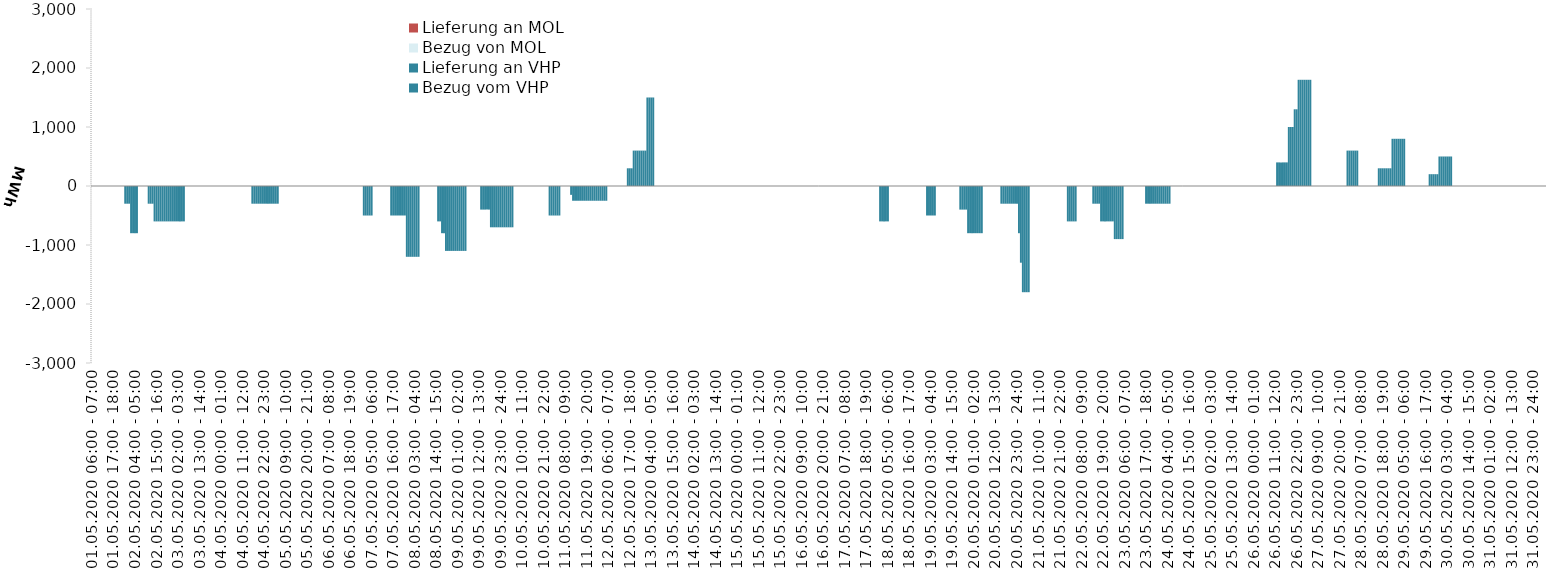
| Category | Bezug vom VHP | Lieferung an VHP | Bezug von MOL | Lieferung an MOL |
|---|---|---|---|---|
| 01.05.2020 06:00 - 07:00 | 0 | 0 | 0 | 0 |
| 01.05.2020 07:00 - 08:00 | 0 | 0 | 0 | 0 |
| 01.05.2020 08:00 - 09:00 | 0 | 0 | 0 | 0 |
| 01.05.2020 09:00 - 10:00 | 0 | 0 | 0 | 0 |
| 01.05.2020 10:00 - 11:00 | 0 | 0 | 0 | 0 |
| 01.05.2020 11:00 - 12:00 | 0 | 0 | 0 | 0 |
| 01.05.2020 12:00 - 13:00 | 0 | 0 | 0 | 0 |
| 01.05.2020 13:00 - 14:00 | 0 | 0 | 0 | 0 |
| 01.05.2020 14:00 - 15:00 | 0 | 0 | 0 | 0 |
| 01.05.2020 15:00 - 16:00 | 0 | 0 | 0 | 0 |
| 01.05.2020 16:00 - 17:00 | 0 | 0 | 0 | 0 |
| 01.05.2020 17:00 - 18:00 | 0 | 0 | 0 | 0 |
| 01.05.2020 18:00 - 19:00 | 0 | 0 | 0 | 0 |
| 01.05.2020 19:00 - 20:00 | 0 | 0 | 0 | 0 |
| 01.05.2020 20:00 - 21:00 | 0 | 0 | 0 | 0 |
| 01.05.2020 21:00 - 22:00 | 0 | 0 | 0 | 0 |
| 01.05.2020 22:00 - 23:00 | 0 | 0 | 0 | 0 |
| 01.05.2020 23:00 - 24:00 | 0 | -300 | 0 | 0 |
| 02.05.2020 00:00 - 01:00 | 0 | -300 | 0 | 0 |
| 02.05.2020 01:00 - 02:00 | 0 | -300 | 0 | 0 |
| 02.05.2020 02:00 - 03:00 | 0 | -800 | 0 | 0 |
| 02.05.2020 03:00 - 04:00 | 0 | -800 | 0 | 0 |
| 02.05.2020 04:00 - 05:00 | 0 | -800 | 0 | 0 |
| 02.05.2020 05:00 - 06:00 | 0 | -800 | 0 | 0 |
| 02.05.2020 06:00 - 07:00 | 0 | 0 | 0 | 0 |
| 02.05.2020 07:00 - 08:00 | 0 | 0 | 0 | 0 |
| 02.05.2020 08:00 - 09:00 | 0 | 0 | 0 | 0 |
| 02.05.2020 09:00 - 10:00 | 0 | 0 | 0 | 0 |
| 02.05.2020 10:00 - 11:00 | 0 | 0 | 0 | 0 |
| 02.05.2020 11:00 - 12:00 | 0 | -300 | 0 | 0 |
| 02.05.2020 12:00 - 13:00 | 0 | -300 | 0 | 0 |
| 02.05.2020 13:00 - 14:00 | 0 | -300 | 0 | 0 |
| 02.05.2020 14:00 - 15:00 | 0 | -600 | 0 | 0 |
| 02.05.2020 15:00 - 16:00 | 0 | -600 | 0 | 0 |
| 02.05.2020 16:00 - 17:00 | 0 | -600 | 0 | 0 |
| 02.05.2020 17:00 - 18:00 | 0 | -600 | 0 | 0 |
| 02.05.2020 18:00 - 19:00 | 0 | -600 | 0 | 0 |
| 02.05.2020 19:00 - 20:00 | 0 | -600 | 0 | 0 |
| 02.05.2020 20:00 - 21:00 | 0 | -600 | 0 | 0 |
| 02.05.2020 21:00 - 22:00 | 0 | -600 | 0 | 0 |
| 02.05.2020 22:00 - 23:00 | 0 | -600 | 0 | 0 |
| 02.05.2020 23:00 - 24:00 | 0 | -600 | 0 | 0 |
| 03.05.2020 00:00 - 01:00 | 0 | -600 | 0 | 0 |
| 03.05.2020 01:00 - 02:00 | 0 | -600 | 0 | 0 |
| 03.05.2020 02:00 - 03:00 | 0 | -600 | 0 | 0 |
| 03.05.2020 03:00 - 04:00 | 0 | -600 | 0 | 0 |
| 03.05.2020 04:00 - 05:00 | 0 | -600 | 0 | 0 |
| 03.05.2020 05:00 - 06:00 | 0 | -600 | 0 | 0 |
| 03.05.2020 06:00 - 07:00 | 0 | 0 | 0 | 0 |
| 03.05.2020 07:00 - 08:00 | 0 | 0 | 0 | 0 |
| 03.05.2020 08:00 - 09:00 | 0 | 0 | 0 | 0 |
| 03.05.2020 09:00 - 10:00 | 0 | 0 | 0 | 0 |
| 03.05.2020 10:00 - 11:00 | 0 | 0 | 0 | 0 |
| 03.05.2020 11:00 - 12:00 | 0 | 0 | 0 | 0 |
| 03.05.2020 12:00 - 13:00 | 0 | 0 | 0 | 0 |
| 03.05.2020 13:00 - 14:00 | 0 | 0 | 0 | 0 |
| 03.05.2020 14:00 - 15:00 | 0 | 0 | 0 | 0 |
| 03.05.2020 15:00 - 16:00 | 0 | 0 | 0 | 0 |
| 03.05.2020 16:00 - 17:00 | 0 | 0 | 0 | 0 |
| 03.05.2020 17:00 - 18:00 | 0 | 0 | 0 | 0 |
| 03.05.2020 18:00 - 19:00 | 0 | 0 | 0 | 0 |
| 03.05.2020 19:00 - 20:00 | 0 | 0 | 0 | 0 |
| 03.05.2020 20:00 - 21:00 | 0 | 0 | 0 | 0 |
| 03.05.2020 21:00 - 22:00 | 0 | 0 | 0 | 0 |
| 03.05.2020 22:00 - 23:00 | 0 | 0 | 0 | 0 |
| 03.05.2020 23:00 - 24:00 | 0 | 0 | 0 | 0 |
| 04.05.2020 00:00 - 01:00 | 0 | 0 | 0 | 0 |
| 04.05.2020 01:00 - 02:00 | 0 | 0 | 0 | 0 |
| 04.05.2020 02:00 - 03:00 | 0 | 0 | 0 | 0 |
| 04.05.2020 03:00 - 04:00 | 0 | 0 | 0 | 0 |
| 04.05.2020 04:00 - 05:00 | 0 | 0 | 0 | 0 |
| 04.05.2020 05:00 - 06:00 | 0 | 0 | 0 | 0 |
| 04.05.2020 06:00 - 07:00 | 0 | 0 | 0 | 0 |
| 04.05.2020 07:00 - 08:00 | 0 | 0 | 0 | 0 |
| 04.05.2020 08:00 - 09:00 | 0 | 0 | 0 | 0 |
| 04.05.2020 09:00 - 10:00 | 0 | 0 | 0 | 0 |
| 04.05.2020 10:00 - 11:00 | 0 | 0 | 0 | 0 |
| 04.05.2020 11:00 - 12:00 | 0 | 0 | 0 | 0 |
| 04.05.2020 12:00 - 13:00 | 0 | 0 | 0 | 0 |
| 04.05.2020 13:00 - 14:00 | 0 | 0 | 0 | 0 |
| 04.05.2020 14:00 - 15:00 | 0 | 0 | 0 | 0 |
| 04.05.2020 15:00 - 16:00 | 0 | 0 | 0 | 0 |
| 04.05.2020 16:00 - 17:00 | 0 | -300 | 0 | 0 |
| 04.05.2020 17:00 - 18:00 | 0 | -300 | 0 | 0 |
| 04.05.2020 18:00 - 19:00 | 0 | -300 | 0 | 0 |
| 04.05.2020 19:00 - 20:00 | 0 | -300 | 0 | 0 |
| 04.05.2020 20:00 - 21:00 | 0 | -300 | 0 | 0 |
| 04.05.2020 21:00 - 22:00 | 0 | -300 | 0 | 0 |
| 04.05.2020 22:00 - 23:00 | 0 | -300 | 0 | 0 |
| 04.05.2020 23:00 - 24:00 | 0 | -300 | 0 | 0 |
| 05.05.2020 00:00 - 01:00 | 0 | -300 | 0 | 0 |
| 05.05.2020 01:00 - 02:00 | 0 | -300 | 0 | 0 |
| 05.05.2020 02:00 - 03:00 | 0 | -300 | 0 | 0 |
| 05.05.2020 03:00 - 04:00 | 0 | -300 | 0 | 0 |
| 05.05.2020 04:00 - 05:00 | 0 | -300 | 0 | 0 |
| 05.05.2020 05:00 - 06:00 | 0 | -300 | 0 | 0 |
| 05.05.2020 06:00 - 07:00 | 0 | 0 | 0 | 0 |
| 05.05.2020 07:00 - 08:00 | 0 | 0 | 0 | 0 |
| 05.05.2020 08:00 - 09:00 | 0 | 0 | 0 | 0 |
| 05.05.2020 09:00 - 10:00 | 0 | 0 | 0 | 0 |
| 05.05.2020 10:00 - 11:00 | 0 | 0 | 0 | 0 |
| 05.05.2020 11:00 - 12:00 | 0 | 0 | 0 | 0 |
| 05.05.2020 12:00 - 13:00 | 0 | 0 | 0 | 0 |
| 05.05.2020 13:00 - 14:00 | 0 | 0 | 0 | 0 |
| 05.05.2020 14:00 - 15:00 | 0 | 0 | 0 | 0 |
| 05.05.2020 15:00 - 16:00 | 0 | 0 | 0 | 0 |
| 05.05.2020 16:00 - 17:00 | 0 | 0 | 0 | 0 |
| 05.05.2020 17:00 - 18:00 | 0 | 0 | 0 | 0 |
| 05.05.2020 18:00 - 19:00 | 0 | 0 | 0 | 0 |
| 05.05.2020 19:00 - 20:00 | 0 | 0 | 0 | 0 |
| 05.05.2020 20:00 - 21:00 | 0 | 0 | 0 | 0 |
| 05.05.2020 21:00 - 22:00 | 0 | 0 | 0 | 0 |
| 05.05.2020 22:00 - 23:00 | 0 | 0 | 0 | 0 |
| 05.05.2020 23:00 - 24:00 | 0 | 0 | 0 | 0 |
| 06.05.2020 00:00 - 01:00 | 0 | 0 | 0 | 0 |
| 06.05.2020 01:00 - 02:00 | 0 | 0 | 0 | 0 |
| 06.05.2020 02:00 - 03:00 | 0 | 0 | 0 | 0 |
| 06.05.2020 03:00 - 04:00 | 0 | 0 | 0 | 0 |
| 06.05.2020 04:00 - 05:00 | 0 | 0 | 0 | 0 |
| 06.05.2020 05:00 - 06:00 | 0 | 0 | 0 | 0 |
| 06.05.2020 06:00 - 07:00 | 0 | 0 | 0 | 0 |
| 06.05.2020 07:00 - 08:00 | 0 | 0 | 0 | 0 |
| 06.05.2020 08:00 - 09:00 | 0 | 0 | 0 | 0 |
| 06.05.2020 09:00 - 10:00 | 0 | 0 | 0 | 0 |
| 06.05.2020 10:00 - 11:00 | 0 | 0 | 0 | 0 |
| 06.05.2020 11:00 - 12:00 | 0 | 0 | 0 | 0 |
| 06.05.2020 12:00 - 13:00 | 0 | 0 | 0 | 0 |
| 06.05.2020 13:00 - 14:00 | 0 | 0 | 0 | 0 |
| 06.05.2020 14:00 - 15:00 | 0 | 0 | 0 | 0 |
| 06.05.2020 15:00 - 16:00 | 0 | 0 | 0 | 0 |
| 06.05.2020 16:00 - 17:00 | 0 | 0 | 0 | 0 |
| 06.05.2020 17:00 - 18:00 | 0 | 0 | 0 | 0 |
| 06.05.2020 18:00 - 19:00 | 0 | 0 | 0 | 0 |
| 06.05.2020 19:00 - 20:00 | 0 | 0 | 0 | 0 |
| 06.05.2020 20:00 - 21:00 | 0 | 0 | 0 | 0 |
| 06.05.2020 21:00 - 22:00 | 0 | 0 | 0 | 0 |
| 06.05.2020 22:00 - 23:00 | 0 | 0 | 0 | 0 |
| 06.05.2020 23:00 - 24:00 | 0 | 0 | 0 | 0 |
| 07.05.2020 00:00 - 01:00 | 0 | 0 | 0 | 0 |
| 07.05.2020 01:00 - 02:00 | 0 | -500 | 0 | 0 |
| 07.05.2020 02:00 - 03:00 | 0 | -500 | 0 | 0 |
| 07.05.2020 03:00 - 04:00 | 0 | -500 | 0 | 0 |
| 07.05.2020 04:00 - 05:00 | 0 | -500 | 0 | 0 |
| 07.05.2020 05:00 - 06:00 | 0 | -500 | 0 | 0 |
| 07.05.2020 06:00 - 07:00 | 0 | 0 | 0 | 0 |
| 07.05.2020 07:00 - 08:00 | 0 | 0 | 0 | 0 |
| 07.05.2020 08:00 - 09:00 | 0 | 0 | 0 | 0 |
| 07.05.2020 09:00 - 10:00 | 0 | 0 | 0 | 0 |
| 07.05.2020 10:00 - 11:00 | 0 | 0 | 0 | 0 |
| 07.05.2020 11:00 - 12:00 | 0 | 0 | 0 | 0 |
| 07.05.2020 12:00 - 13:00 | 0 | 0 | 0 | 0 |
| 07.05.2020 13:00 - 14:00 | 0 | 0 | 0 | 0 |
| 07.05.2020 14:00 - 15:00 | 0 | 0 | 0 | 0 |
| 07.05.2020 15:00 - 16:00 | 0 | -500 | 0 | 0 |
| 07.05.2020 16:00 - 17:00 | 0 | -500 | 0 | 0 |
| 07.05.2020 17:00 - 18:00 | 0 | -500 | 0 | 0 |
| 07.05.2020 18:00 - 19:00 | 0 | -500 | 0 | 0 |
| 07.05.2020 19:00 - 20:00 | 0 | -500 | 0 | 0 |
| 07.05.2020 20:00 - 21:00 | 0 | -500 | 0 | 0 |
| 07.05.2020 21:00 - 22:00 | 0 | -500 | 0 | 0 |
| 07.05.2020 22:00 - 23:00 | 0 | -500 | 0 | 0 |
| 07.05.2020 23:00 - 24:00 | 0 | -1200 | 0 | 0 |
| 08.05.2020 00:00 - 01:00 | 0 | -1200 | 0 | 0 |
| 08.05.2020 01:00 - 02:00 | 0 | -1200 | 0 | 0 |
| 08.05.2020 02:00 - 03:00 | 0 | -1200 | 0 | 0 |
| 08.05.2020 03:00 - 04:00 | 0 | -1200 | 0 | 0 |
| 08.05.2020 04:00 - 05:00 | 0 | -1200 | 0 | 0 |
| 08.05.2020 05:00 - 06:00 | 0 | -1200 | 0 | 0 |
| 08.05.2020 06:00 - 07:00 | 0 | 0 | 0 | 0 |
| 08.05.2020 07:00 - 08:00 | 0 | 0 | 0 | 0 |
| 08.05.2020 08:00 - 09:00 | 0 | 0 | 0 | 0 |
| 08.05.2020 09:00 - 10:00 | 0 | 0 | 0 | 0 |
| 08.05.2020 10:00 - 11:00 | 0 | 0 | 0 | 0 |
| 08.05.2020 11:00 - 12:00 | 0 | 0 | 0 | 0 |
| 08.05.2020 12:00 - 13:00 | 0 | 0 | 0 | 0 |
| 08.05.2020 13:00 - 14:00 | 0 | 0 | 0 | 0 |
| 08.05.2020 14:00 - 15:00 | 0 | 0 | 0 | 0 |
| 08.05.2020 15:00 - 16:00 | 0 | -600 | 0 | 0 |
| 08.05.2020 16:00 - 17:00 | 0 | -600 | 0 | 0 |
| 08.05.2020 17:00 - 18:00 | 0 | -800 | 0 | 0 |
| 08.05.2020 18:00 - 19:00 | 0 | -800 | 0 | 0 |
| 08.05.2020 19:00 - 20:00 | 0 | -1100 | 0 | 0 |
| 08.05.2020 20:00 - 21:00 | 0 | -1100 | 0 | 0 |
| 08.05.2020 21:00 - 22:00 | 0 | -1100 | 0 | 0 |
| 08.05.2020 22:00 - 23:00 | 0 | -1100 | 0 | 0 |
| 08.05.2020 23:00 - 24:00 | 0 | -1100 | 0 | 0 |
| 09.05.2020 00:00 - 01:00 | 0 | -1100 | 0 | 0 |
| 09.05.2020 01:00 - 02:00 | 0 | -1100 | 0 | 0 |
| 09.05.2020 02:00 - 03:00 | 0 | -1100 | 0 | 0 |
| 09.05.2020 03:00 - 04:00 | 0 | -1100 | 0 | 0 |
| 09.05.2020 04:00 - 05:00 | 0 | -1100 | 0 | 0 |
| 09.05.2020 05:00 - 06:00 | 0 | -1100 | 0 | 0 |
| 09.05.2020 06:00 - 07:00 | 0 | 0 | 0 | 0 |
| 09.05.2020 07:00 - 08:00 | 0 | 0 | 0 | 0 |
| 09.05.2020 08:00 - 09:00 | 0 | 0 | 0 | 0 |
| 09.05.2020 09:00 - 10:00 | 0 | 0 | 0 | 0 |
| 09.05.2020 10:00 - 11:00 | 0 | 0 | 0 | 0 |
| 09.05.2020 11:00 - 12:00 | 0 | 0 | 0 | 0 |
| 09.05.2020 12:00 - 13:00 | 0 | 0 | 0 | 0 |
| 09.05.2020 13:00 - 14:00 | 0 | -400 | 0 | 0 |
| 09.05.2020 14:00 - 15:00 | 0 | -400 | 0 | 0 |
| 09.05.2020 15:00 - 16:00 | 0 | -400 | 0 | 0 |
| 09.05.2020 16:00 - 17:00 | 0 | -400 | 0 | 0 |
| 09.05.2020 17:00 - 18:00 | 0 | -400 | 0 | 0 |
| 09.05.2020 18:00 - 19:00 | 0 | -700 | 0 | 0 |
| 09.05.2020 19:00 - 20:00 | 0 | -700 | 0 | 0 |
| 09.05.2020 20:00 - 21:00 | 0 | -700 | 0 | 0 |
| 09.05.2020 21:00 - 22:00 | 0 | -700 | 0 | 0 |
| 09.05.2020 22:00 - 23:00 | 0 | -700 | 0 | 0 |
| 09.05.2020 23:00 - 24:00 | 0 | -700 | 0 | 0 |
| 10.05.2020 00:00 - 01:00 | 0 | -700 | 0 | 0 |
| 10.05.2020 01:00 - 02:00 | 0 | -700 | 0 | 0 |
| 10.05.2020 02:00 - 03:00 | 0 | -700 | 0 | 0 |
| 10.05.2020 03:00 - 04:00 | 0 | -700 | 0 | 0 |
| 10.05.2020 04:00 - 05:00 | 0 | -700 | 0 | 0 |
| 10.05.2020 05:00 - 06:00 | 0 | -700 | 0 | 0 |
| 10.05.2020 06:00 - 07:00 | 0 | 0 | 0 | 0 |
| 10.05.2020 07:00 - 08:00 | 0 | 0 | 0 | 0 |
| 10.05.2020 08:00 - 09:00 | 0 | 0 | 0 | 0 |
| 10.05.2020 09:00 - 10:00 | 0 | 0 | 0 | 0 |
| 10.05.2020 10:00 - 11:00 | 0 | 0 | 0 | 0 |
| 10.05.2020 11:00 - 12:00 | 0 | 0 | 0 | 0 |
| 10.05.2020 12:00 - 13:00 | 0 | 0 | 0 | 0 |
| 10.05.2020 13:00 - 14:00 | 0 | 0 | 0 | 0 |
| 10.05.2020 14:00 - 15:00 | 0 | 0 | 0 | 0 |
| 10.05.2020 15:00 - 16:00 | 0 | 0 | 0 | 0 |
| 10.05.2020 16:00 - 17:00 | 0 | 0 | 0 | 0 |
| 10.05.2020 17:00 - 18:00 | 0 | 0 | 0 | 0 |
| 10.05.2020 18:00 - 19:00 | 0 | 0 | 0 | 0 |
| 10.05.2020 19:00 - 20:00 | 0 | 0 | 0 | 0 |
| 10.05.2020 20:00 - 21:00 | 0 | 0 | 0 | 0 |
| 10.05.2020 21:00 - 22:00 | 0 | 0 | 0 | 0 |
| 10.05.2020 22:00 - 23:00 | 0 | 0 | 0 | 0 |
| 10.05.2020 23:00 - 24:00 | 0 | 0 | 0 | 0 |
| 11.05.2020 00:00 - 01:00 | 0 | -500 | 0 | 0 |
| 11.05.2020 01:00 - 02:00 | 0 | -500 | 0 | 0 |
| 11.05.2020 02:00 - 03:00 | 0 | -500 | 0 | 0 |
| 11.05.2020 03:00 - 04:00 | 0 | -500 | 0 | 0 |
| 11.05.2020 04:00 - 05:00 | 0 | -500 | 0 | 0 |
| 11.05.2020 05:00 - 06:00 | 0 | -500 | 0 | 0 |
| 11.05.2020 06:00 - 07:00 | 0 | 0 | 0 | 0 |
| 11.05.2020 07:00 - 08:00 | 0 | 0 | 0 | 0 |
| 11.05.2020 08:00 - 09:00 | 0 | 0 | 0 | 0 |
| 11.05.2020 09:00 - 10:00 | 0 | 0 | 0 | 0 |
| 11.05.2020 10:00 - 11:00 | 0 | 0 | 0 | 0 |
| 11.05.2020 11:00 - 12:00 | 0 | -150 | 0 | 0 |
| 11.05.2020 12:00 - 13:00 | 0 | -250 | 0 | 0 |
| 11.05.2020 13:00 - 14:00 | 0 | -250 | 0 | 0 |
| 11.05.2020 14:00 - 15:00 | 0 | -250 | 0 | 0 |
| 11.05.2020 15:00 - 16:00 | 0 | -250 | 0 | 0 |
| 11.05.2020 16:00 - 17:00 | 0 | -250 | 0 | 0 |
| 11.05.2020 17:00 - 18:00 | 0 | -250 | 0 | 0 |
| 11.05.2020 18:00 - 19:00 | 0 | -250 | 0 | 0 |
| 11.05.2020 19:00 - 20:00 | 0 | -250 | 0 | 0 |
| 11.05.2020 20:00 - 21:00 | 0 | -250 | 0 | 0 |
| 11.05.2020 21:00 - 22:00 | 0 | -250 | 0 | 0 |
| 11.05.2020 22:00 - 23:00 | 0 | -250 | 0 | 0 |
| 11.05.2020 23:00 - 24:00 | 0 | -250 | 0 | 0 |
| 12.05.2020 00:00 - 01:00 | 0 | -250 | 0 | 0 |
| 12.05.2020 01:00 - 02:00 | 0 | -250 | 0 | 0 |
| 12.05.2020 02:00 - 03:00 | 0 | -250 | 0 | 0 |
| 12.05.2020 03:00 - 04:00 | 0 | -250 | 0 | 0 |
| 12.05.2020 04:00 - 05:00 | 0 | -250 | 0 | 0 |
| 12.05.2020 05:00 - 06:00 | 0 | -250 | 0 | 0 |
| 12.05.2020 06:00 - 07:00 | 0 | 0 | 0 | 0 |
| 12.05.2020 07:00 - 08:00 | 0 | 0 | 0 | 0 |
| 12.05.2020 08:00 - 09:00 | 0 | 0 | 0 | 0 |
| 12.05.2020 09:00 - 10:00 | 0 | 0 | 0 | 0 |
| 12.05.2020 10:00 - 11:00 | 0 | 0 | 0 | 0 |
| 12.05.2020 11:00 - 12:00 | 0 | 0 | 0 | 0 |
| 12.05.2020 12:00 - 13:00 | 0 | 0 | 0 | 0 |
| 12.05.2020 13:00 - 14:00 | 0 | 0 | 0 | 0 |
| 12.05.2020 14:00 - 15:00 | 0 | 0 | 0 | 0 |
| 12.05.2020 15:00 - 16:00 | 0 | 0 | 0 | 0 |
| 12.05.2020 16:00 - 17:00 | 300 | 0 | 0 | 0 |
| 12.05.2020 17:00 - 18:00 | 300 | 0 | 0 | 0 |
| 12.05.2020 18:00 - 19:00 | 300 | 0 | 0 | 0 |
| 12.05.2020 19:00 - 20:00 | 600 | 0 | 0 | 0 |
| 12.05.2020 20:00 - 21:00 | 600 | 0 | 0 | 0 |
| 12.05.2020 21:00 - 22:00 | 600 | 0 | 0 | 0 |
| 12.05.2020 22:00 - 23:00 | 600 | 0 | 0 | 0 |
| 12.05.2020 23:00 - 24:00 | 600 | 0 | 0 | 0 |
| 13.05.2020 00:00 - 01:00 | 600 | 0 | 0 | 0 |
| 13.05.2020 01:00 - 02:00 | 600 | 0 | 0 | 0 |
| 13.05.2020 02:00 - 03:00 | 1500 | 0 | 0 | 0 |
| 13.05.2020 03:00 - 04:00 | 1500 | 0 | 0 | 0 |
| 13.05.2020 04:00 - 05:00 | 1500 | 0 | 0 | 0 |
| 13.05.2020 05:00 - 06:00 | 1500 | 0 | 0 | 0 |
| 13.05.2020 06:00 - 07:00 | 0 | 0 | 0 | 0 |
| 13.05.2020 07:00 - 08:00 | 0 | 0 | 0 | 0 |
| 13.05.2020 08:00 - 09:00 | 0 | 0 | 0 | 0 |
| 13.05.2020 09:00 - 10:00 | 0 | 0 | 0 | 0 |
| 13.05.2020 10:00 - 11:00 | 0 | 0 | 0 | 0 |
| 13.05.2020 11:00 - 12:00 | 0 | 0 | 0 | 0 |
| 13.05.2020 12:00 - 13:00 | 0 | 0 | 0 | 0 |
| 13.05.2020 13:00 - 14:00 | 0 | 0 | 0 | 0 |
| 13.05.2020 14:00 - 15:00 | 0 | 0 | 0 | 0 |
| 13.05.2020 15:00 - 16:00 | 0 | 0 | 0 | 0 |
| 13.05.2020 16:00 - 17:00 | 0 | 0 | 0 | 0 |
| 13.05.2020 17:00 - 18:00 | 0 | 0 | 0 | 0 |
| 13.05.2020 18:00 - 19:00 | 0 | 0 | 0 | 0 |
| 13.05.2020 19:00 - 20:00 | 0 | 0 | 0 | 0 |
| 13.05.2020 20:00 - 21:00 | 0 | 0 | 0 | 0 |
| 13.05.2020 21:00 - 22:00 | 0 | 0 | 0 | 0 |
| 13.05.2020 22:00 - 23:00 | 0 | 0 | 0 | 0 |
| 13.05.2020 23:00 - 24:00 | 0 | 0 | 0 | 0 |
| 14.05.2020 00:00 - 01:00 | 0 | 0 | 0 | 0 |
| 14.05.2020 01:00 - 02:00 | 0 | 0 | 0 | 0 |
| 14.05.2020 02:00 - 03:00 | 0 | 0 | 0 | 0 |
| 14.05.2020 03:00 - 04:00 | 0 | 0 | 0 | 0 |
| 14.05.2020 04:00 - 05:00 | 0 | 0 | 0 | 0 |
| 14.05.2020 05:00 - 06:00 | 0 | 0 | 0 | 0 |
| 14.05.2020 06:00 - 07:00 | 0 | 0 | 0 | 0 |
| 14.05.2020 07:00 - 08:00 | 0 | 0 | 0 | 0 |
| 14.05.2020 08:00 - 09:00 | 0 | 0 | 0 | 0 |
| 14.05.2020 09:00 - 10:00 | 0 | 0 | 0 | 0 |
| 14.05.2020 10:00 - 11:00 | 0 | 0 | 0 | 0 |
| 14.05.2020 11:00 - 12:00 | 0 | 0 | 0 | 0 |
| 14.05.2020 12:00 - 13:00 | 0 | 0 | 0 | 0 |
| 14.05.2020 13:00 - 14:00 | 0 | 0 | 0 | 0 |
| 14.05.2020 14:00 - 15:00 | 0 | 0 | 0 | 0 |
| 14.05.2020 15:00 - 16:00 | 0 | 0 | 0 | 0 |
| 14.05.2020 16:00 - 17:00 | 0 | 0 | 0 | 0 |
| 14.05.2020 17:00 - 18:00 | 0 | 0 | 0 | 0 |
| 14.05.2020 18:00 - 19:00 | 0 | 0 | 0 | 0 |
| 14.05.2020 19:00 - 20:00 | 0 | 0 | 0 | 0 |
| 14.05.2020 20:00 - 21:00 | 0 | 0 | 0 | 0 |
| 14.05.2020 21:00 - 22:00 | 0 | 0 | 0 | 0 |
| 14.05.2020 22:00 - 23:00 | 0 | 0 | 0 | 0 |
| 14.05.2020 23:00 - 24:00 | 0 | 0 | 0 | 0 |
| 15.05.2020 00:00 - 01:00 | 0 | 0 | 0 | 0 |
| 15.05.2020 01:00 - 02:00 | 0 | 0 | 0 | 0 |
| 15.05.2020 02:00 - 03:00 | 0 | 0 | 0 | 0 |
| 15.05.2020 03:00 - 04:00 | 0 | 0 | 0 | 0 |
| 15.05.2020 04:00 - 05:00 | 0 | 0 | 0 | 0 |
| 15.05.2020 05:00 - 06:00 | 0 | 0 | 0 | 0 |
| 15.05.2020 06:00 - 07:00 | 0 | 0 | 0 | 0 |
| 15.05.2020 07:00 - 08:00 | 0 | 0 | 0 | 0 |
| 15.05.2020 08:00 - 09:00 | 0 | 0 | 0 | 0 |
| 15.05.2020 09:00 - 10:00 | 0 | 0 | 0 | 0 |
| 15.05.2020 10:00 - 11:00 | 0 | 0 | 0 | 0 |
| 15.05.2020 11:00 - 12:00 | 0 | 0 | 0 | 0 |
| 15.05.2020 12:00 - 13:00 | 0 | 0 | 0 | 0 |
| 15.05.2020 13:00 - 14:00 | 0 | 0 | 0 | 0 |
| 15.05.2020 14:00 - 15:00 | 0 | 0 | 0 | 0 |
| 15.05.2020 15:00 - 16:00 | 0 | 0 | 0 | 0 |
| 15.05.2020 16:00 - 17:00 | 0 | 0 | 0 | 0 |
| 15.05.2020 17:00 - 18:00 | 0 | 0 | 0 | 0 |
| 15.05.2020 18:00 - 19:00 | 0 | 0 | 0 | 0 |
| 15.05.2020 19:00 - 20:00 | 0 | 0 | 0 | 0 |
| 15.05.2020 20:00 - 21:00 | 0 | 0 | 0 | 0 |
| 15.05.2020 21:00 - 22:00 | 0 | 0 | 0 | 0 |
| 15.05.2020 22:00 - 23:00 | 0 | 0 | 0 | 0 |
| 15.05.2020 23:00 - 24:00 | 0 | 0 | 0 | 0 |
| 16.05.2020 00:00 - 01:00 | 0 | 0 | 0 | 0 |
| 16.05.2020 01:00 - 02:00 | 0 | 0 | 0 | 0 |
| 16.05.2020 02:00 - 03:00 | 0 | 0 | 0 | 0 |
| 16.05.2020 03:00 - 04:00 | 0 | 0 | 0 | 0 |
| 16.05.2020 04:00 - 05:00 | 0 | 0 | 0 | 0 |
| 16.05.2020 05:00 - 06:00 | 0 | 0 | 0 | 0 |
| 16.05.2020 06:00 - 07:00 | 0 | 0 | 0 | 0 |
| 16.05.2020 07:00 - 08:00 | 0 | 0 | 0 | 0 |
| 16.05.2020 08:00 - 09:00 | 0 | 0 | 0 | 0 |
| 16.05.2020 09:00 - 10:00 | 0 | 0 | 0 | 0 |
| 16.05.2020 10:00 - 11:00 | 0 | 0 | 0 | 0 |
| 16.05.2020 11:00 - 12:00 | 0 | 0 | 0 | 0 |
| 16.05.2020 12:00 - 13:00 | 0 | 0 | 0 | 0 |
| 16.05.2020 13:00 - 14:00 | 0 | 0 | 0 | 0 |
| 16.05.2020 14:00 - 15:00 | 0 | 0 | 0 | 0 |
| 16.05.2020 15:00 - 16:00 | 0 | 0 | 0 | 0 |
| 16.05.2020 16:00 - 17:00 | 0 | 0 | 0 | 0 |
| 16.05.2020 17:00 - 18:00 | 0 | 0 | 0 | 0 |
| 16.05.2020 18:00 - 19:00 | 0 | 0 | 0 | 0 |
| 16.05.2020 19:00 - 20:00 | 0 | 0 | 0 | 0 |
| 16.05.2020 20:00 - 21:00 | 0 | 0 | 0 | 0 |
| 16.05.2020 21:00 - 22:00 | 0 | 0 | 0 | 0 |
| 16.05.2020 22:00 - 23:00 | 0 | 0 | 0 | 0 |
| 16.05.2020 23:00 - 24:00 | 0 | 0 | 0 | 0 |
| 17.05.2020 00:00 - 01:00 | 0 | 0 | 0 | 0 |
| 17.05.2020 01:00 - 02:00 | 0 | 0 | 0 | 0 |
| 17.05.2020 02:00 - 03:00 | 0 | 0 | 0 | 0 |
| 17.05.2020 03:00 - 04:00 | 0 | 0 | 0 | 0 |
| 17.05.2020 04:00 - 05:00 | 0 | 0 | 0 | 0 |
| 17.05.2020 05:00 - 06:00 | 0 | 0 | 0 | 0 |
| 17.05.2020 06:00 - 07:00 | 0 | 0 | 0 | 0 |
| 17.05.2020 07:00 - 08:00 | 0 | 0 | 0 | 0 |
| 17.05.2020 08:00 - 09:00 | 0 | 0 | 0 | 0 |
| 17.05.2020 09:00 - 10:00 | 0 | 0 | 0 | 0 |
| 17.05.2020 10:00 - 11:00 | 0 | 0 | 0 | 0 |
| 17.05.2020 11:00 - 12:00 | 0 | 0 | 0 | 0 |
| 17.05.2020 12:00 - 13:00 | 0 | 0 | 0 | 0 |
| 17.05.2020 13:00 - 14:00 | 0 | 0 | 0 | 0 |
| 17.05.2020 14:00 - 15:00 | 0 | 0 | 0 | 0 |
| 17.05.2020 15:00 - 16:00 | 0 | 0 | 0 | 0 |
| 17.05.2020 16:00 - 17:00 | 0 | 0 | 0 | 0 |
| 17.05.2020 17:00 - 18:00 | 0 | 0 | 0 | 0 |
| 17.05.2020 18:00 - 19:00 | 0 | 0 | 0 | 0 |
| 17.05.2020 19:00 - 20:00 | 0 | 0 | 0 | 0 |
| 17.05.2020 20:00 - 21:00 | 0 | 0 | 0 | 0 |
| 17.05.2020 21:00 - 22:00 | 0 | 0 | 0 | 0 |
| 17.05.2020 22:00 - 23:00 | 0 | 0 | 0 | 0 |
| 17.05.2020 23:00 - 24:00 | 0 | 0 | 0 | 0 |
| 18.05.2020 00:00 - 01:00 | 0 | 0 | 0 | 0 |
| 18.05.2020 01:00 - 02:00 | 0 | -600 | 0 | 0 |
| 18.05.2020 02:00 - 03:00 | 0 | -600 | 0 | 0 |
| 18.05.2020 03:00 - 04:00 | 0 | -600 | 0 | 0 |
| 18.05.2020 04:00 - 05:00 | 0 | -600 | 0 | 0 |
| 18.05.2020 05:00 - 06:00 | 0 | -600 | 0 | 0 |
| 18.05.2020 06:00 - 07:00 | 0 | 0 | 0 | 0 |
| 18.05.2020 07:00 - 08:00 | 0 | 0 | 0 | 0 |
| 18.05.2020 08:00 - 09:00 | 0 | 0 | 0 | 0 |
| 18.05.2020 09:00 - 10:00 | 0 | 0 | 0 | 0 |
| 18.05.2020 10:00 - 11:00 | 0 | 0 | 0 | 0 |
| 18.05.2020 11:00 - 12:00 | 0 | 0 | 0 | 0 |
| 18.05.2020 12:00 - 13:00 | 0 | 0 | 0 | 0 |
| 18.05.2020 13:00 - 14:00 | 0 | 0 | 0 | 0 |
| 18.05.2020 14:00 - 15:00 | 0 | 0 | 0 | 0 |
| 18.05.2020 15:00 - 16:00 | 0 | 0 | 0 | 0 |
| 18.05.2020 16:00 - 17:00 | 0 | 0 | 0 | 0 |
| 18.05.2020 17:00 - 18:00 | 0 | 0 | 0 | 0 |
| 18.05.2020 18:00 - 19:00 | 0 | 0 | 0 | 0 |
| 18.05.2020 19:00 - 20:00 | 0 | 0 | 0 | 0 |
| 18.05.2020 20:00 - 21:00 | 0 | 0 | 0 | 0 |
| 18.05.2020 21:00 - 22:00 | 0 | 0 | 0 | 0 |
| 18.05.2020 22:00 - 23:00 | 0 | 0 | 0 | 0 |
| 18.05.2020 23:00 - 24:00 | 0 | 0 | 0 | 0 |
| 19.05.2020 00:00 - 01:00 | 0 | 0 | 0 | 0 |
| 19.05.2020 01:00 - 02:00 | 0 | -500 | 0 | 0 |
| 19.05.2020 02:00 - 03:00 | 0 | -500 | 0 | 0 |
| 19.05.2020 03:00 - 04:00 | 0 | -500 | 0 | 0 |
| 19.05.2020 04:00 - 05:00 | 0 | -500 | 0 | 0 |
| 19.05.2020 05:00 - 06:00 | 0 | -500 | 0 | 0 |
| 19.05.2020 06:00 - 07:00 | 0 | 0 | 0 | 0 |
| 19.05.2020 07:00 - 08:00 | 0 | 0 | 0 | 0 |
| 19.05.2020 08:00 - 09:00 | 0 | 0 | 0 | 0 |
| 19.05.2020 09:00 - 10:00 | 0 | 0 | 0 | 0 |
| 19.05.2020 10:00 - 11:00 | 0 | 0 | 0 | 0 |
| 19.05.2020 11:00 - 12:00 | 0 | 0 | 0 | 0 |
| 19.05.2020 12:00 - 13:00 | 0 | 0 | 0 | 0 |
| 19.05.2020 13:00 - 14:00 | 0 | 0 | 0 | 0 |
| 19.05.2020 14:00 - 15:00 | 0 | 0 | 0 | 0 |
| 19.05.2020 15:00 - 16:00 | 0 | 0 | 0 | 0 |
| 19.05.2020 16:00 - 17:00 | 0 | 0 | 0 | 0 |
| 19.05.2020 17:00 - 18:00 | 0 | 0 | 0 | 0 |
| 19.05.2020 18:00 - 19:00 | 0 | -400 | 0 | 0 |
| 19.05.2020 19:00 - 20:00 | 0 | -400 | 0 | 0 |
| 19.05.2020 20:00 - 21:00 | 0 | -400 | 0 | 0 |
| 19.05.2020 21:00 - 22:00 | 0 | -400 | 0 | 0 |
| 19.05.2020 22:00 - 23:00 | 0 | -800 | 0 | 0 |
| 19.05.2020 23:00 - 24:00 | 0 | -800 | 0 | 0 |
| 20.05.2020 00:00 - 01:00 | 0 | -800 | 0 | 0 |
| 20.05.2020 01:00 - 02:00 | 0 | -800 | 0 | 0 |
| 20.05.2020 02:00 - 03:00 | 0 | -800 | 0 | 0 |
| 20.05.2020 03:00 - 04:00 | 0 | -800 | 0 | 0 |
| 20.05.2020 04:00 - 05:00 | 0 | -800 | 0 | 0 |
| 20.05.2020 05:00 - 06:00 | 0 | -800 | 0 | 0 |
| 20.05.2020 06:00 - 07:00 | 0 | 0 | 0 | 0 |
| 20.05.2020 07:00 - 08:00 | 0 | 0 | 0 | 0 |
| 20.05.2020 08:00 - 09:00 | 0 | 0 | 0 | 0 |
| 20.05.2020 09:00 - 10:00 | 0 | 0 | 0 | 0 |
| 20.05.2020 10:00 - 11:00 | 0 | 0 | 0 | 0 |
| 20.05.2020 11:00 - 12:00 | 0 | 0 | 0 | 0 |
| 20.05.2020 12:00 - 13:00 | 0 | 0 | 0 | 0 |
| 20.05.2020 13:00 - 14:00 | 0 | 0 | 0 | 0 |
| 20.05.2020 14:00 - 15:00 | 0 | 0 | 0 | 0 |
| 20.05.2020 15:00 - 16:00 | 0 | -300 | 0 | 0 |
| 20.05.2020 16:00 - 17:00 | 0 | -300 | 0 | 0 |
| 20.05.2020 17:00 - 18:00 | 0 | -300 | 0 | 0 |
| 20.05.2020 18:00 - 19:00 | 0 | -300 | 0 | 0 |
| 20.05.2020 19:00 - 20:00 | 0 | -300 | 0 | 0 |
| 20.05.2020 20:00 - 21:00 | 0 | -300 | 0 | 0 |
| 20.05.2020 21:00 - 22:00 | 0 | -300 | 0 | 0 |
| 20.05.2020 22:00 - 23:00 | 0 | -300 | 0 | 0 |
| 20.05.2020 23:00 - 24:00 | 0 | -300 | 0 | 0 |
| 21.05.2020 00:00 - 01:00 | 0 | -800 | 0 | 0 |
| 21.05.2020 01:00 - 02:00 | 0 | -1300 | 0 | 0 |
| 21.05.2020 02:00 - 03:00 | 0 | -1800 | 0 | 0 |
| 21.05.2020 03:00 - 04:00 | 0 | -1800 | 0 | 0 |
| 21.05.2020 04:00 - 05:00 | 0 | -1800 | 0 | 0 |
| 21.05.2020 05:00 - 06:00 | 0 | -1800 | 0 | 0 |
| 21.05.2020 06:00 - 07:00 | 0 | 0 | 0 | 0 |
| 21.05.2020 07:00 - 08:00 | 0 | 0 | 0 | 0 |
| 21.05.2020 08:00 - 09:00 | 0 | 0 | 0 | 0 |
| 21.05.2020 09:00 - 10:00 | 0 | 0 | 0 | 0 |
| 21.05.2020 10:00 - 11:00 | 0 | 0 | 0 | 0 |
| 21.05.2020 11:00 - 12:00 | 0 | 0 | 0 | 0 |
| 21.05.2020 12:00 - 13:00 | 0 | 0 | 0 | 0 |
| 21.05.2020 13:00 - 14:00 | 0 | 0 | 0 | 0 |
| 21.05.2020 14:00 - 15:00 | 0 | 0 | 0 | 0 |
| 21.05.2020 15:00 - 16:00 | 0 | 0 | 0 | 0 |
| 21.05.2020 16:00 - 17:00 | 0 | 0 | 0 | 0 |
| 21.05.2020 17:00 - 18:00 | 0 | 0 | 0 | 0 |
| 21.05.2020 18:00 - 19:00 | 0 | 0 | 0 | 0 |
| 21.05.2020 19:00 - 20:00 | 0 | 0 | 0 | 0 |
| 21.05.2020 20:00 - 21:00 | 0 | 0 | 0 | 0 |
| 21.05.2020 21:00 - 22:00 | 0 | 0 | 0 | 0 |
| 21.05.2020 22:00 - 23:00 | 0 | 0 | 0 | 0 |
| 21.05.2020 23:00 - 24:00 | 0 | 0 | 0 | 0 |
| 22.05.2020 00:00 - 01:00 | 0 | 0 | 0 | 0 |
| 22.05.2020 01:00 - 02:00 | 0 | -600 | 0 | 0 |
| 22.05.2020 02:00 - 03:00 | 0 | -600 | 0 | 0 |
| 22.05.2020 03:00 - 04:00 | 0 | -600 | 0 | 0 |
| 22.05.2020 04:00 - 05:00 | 0 | -600 | 0 | 0 |
| 22.05.2020 05:00 - 06:00 | 0 | -600 | 0 | 0 |
| 22.05.2020 06:00 - 07:00 | 0 | 0 | 0 | 0 |
| 22.05.2020 07:00 - 08:00 | 0 | 0 | 0 | 0 |
| 22.05.2020 08:00 - 09:00 | 0 | 0 | 0 | 0 |
| 22.05.2020 09:00 - 10:00 | 0 | 0 | 0 | 0 |
| 22.05.2020 10:00 - 11:00 | 0 | 0 | 0 | 0 |
| 22.05.2020 11:00 - 12:00 | 0 | 0 | 0 | 0 |
| 22.05.2020 12:00 - 13:00 | 0 | 0 | 0 | 0 |
| 22.05.2020 13:00 - 14:00 | 0 | 0 | 0 | 0 |
| 22.05.2020 14:00 - 15:00 | 0 | -300 | 0 | 0 |
| 22.05.2020 15:00 - 16:00 | 0 | -300 | 0 | 0 |
| 22.05.2020 16:00 - 17:00 | 0 | -300 | 0 | 0 |
| 22.05.2020 17:00 - 18:00 | 0 | -300 | 0 | 0 |
| 22.05.2020 18:00 - 19:00 | 0 | -600 | 0 | 0 |
| 22.05.2020 19:00 - 20:00 | 0 | -600 | 0 | 0 |
| 22.05.2020 20:00 - 21:00 | 0 | -600 | 0 | 0 |
| 22.05.2020 21:00 - 22:00 | 0 | -600 | 0 | 0 |
| 22.05.2020 22:00 - 23:00 | 0 | -600 | 0 | 0 |
| 22.05.2020 23:00 - 24:00 | 0 | -600 | 0 | 0 |
| 23.05.2020 00:00 - 01:00 | 0 | -600 | 0 | 0 |
| 23.05.2020 01:00 - 02:00 | 0 | -900 | 0 | 0 |
| 23.05.2020 02:00 - 03:00 | 0 | -900 | 0 | 0 |
| 23.05.2020 03:00 - 04:00 | 0 | -900 | 0 | 0 |
| 23.05.2020 04:00 - 05:00 | 0 | -900 | 0 | 0 |
| 23.05.2020 05:00 - 06:00 | 0 | -900 | 0 | 0 |
| 23.05.2020 06:00 - 07:00 | 0 | 0 | 0 | 0 |
| 23.05.2020 07:00 - 08:00 | 0 | 0 | 0 | 0 |
| 23.05.2020 08:00 - 09:00 | 0 | 0 | 0 | 0 |
| 23.05.2020 09:00 - 10:00 | 0 | 0 | 0 | 0 |
| 23.05.2020 10:00 - 11:00 | 0 | 0 | 0 | 0 |
| 23.05.2020 11:00 - 12:00 | 0 | 0 | 0 | 0 |
| 23.05.2020 12:00 - 13:00 | 0 | 0 | 0 | 0 |
| 23.05.2020 13:00 - 14:00 | 0 | 0 | 0 | 0 |
| 23.05.2020 14:00 - 15:00 | 0 | 0 | 0 | 0 |
| 23.05.2020 15:00 - 16:00 | 0 | 0 | 0 | 0 |
| 23.05.2020 16:00 - 17:00 | 0 | 0 | 0 | 0 |
| 23.05.2020 17:00 - 18:00 | 0 | -300 | 0 | 0 |
| 23.05.2020 18:00 - 19:00 | 0 | -300 | 0 | 0 |
| 23.05.2020 19:00 - 20:00 | 0 | -300 | 0 | 0 |
| 23.05.2020 20:00 - 21:00 | 0 | -300 | 0 | 0 |
| 23.05.2020 21:00 - 22:00 | 0 | -300 | 0 | 0 |
| 23.05.2020 22:00 - 23:00 | 0 | -300 | 0 | 0 |
| 23.05.2020 23:00 - 24:00 | 0 | -300 | 0 | 0 |
| 24.05.2020 00:00 - 01:00 | 0 | -300 | 0 | 0 |
| 24.05.2020 01:00 - 02:00 | 0 | -300 | 0 | 0 |
| 24.05.2020 02:00 - 03:00 | 0 | -300 | 0 | 0 |
| 24.05.2020 03:00 - 04:00 | 0 | -300 | 0 | 0 |
| 24.05.2020 04:00 - 05:00 | 0 | -300 | 0 | 0 |
| 24.05.2020 05:00 - 06:00 | 0 | -300 | 0 | 0 |
| 24.05.2020 06:00 - 07:00 | 0 | 0 | 0 | 0 |
| 24.05.2020 07:00 - 08:00 | 0 | 0 | 0 | 0 |
| 24.05.2020 08:00 - 09:00 | 0 | 0 | 0 | 0 |
| 24.05.2020 09:00 - 10:00 | 0 | 0 | 0 | 0 |
| 24.05.2020 10:00 - 11:00 | 0 | 0 | 0 | 0 |
| 24.05.2020 11:00 - 12:00 | 0 | 0 | 0 | 0 |
| 24.05.2020 12:00 - 13:00 | 0 | 0 | 0 | 0 |
| 24.05.2020 13:00 - 14:00 | 0 | 0 | 0 | 0 |
| 24.05.2020 14:00 - 15:00 | 0 | 0 | 0 | 0 |
| 24.05.2020 15:00 - 16:00 | 0 | 0 | 0 | 0 |
| 24.05.2020 16:00 - 17:00 | 0 | 0 | 0 | 0 |
| 24.05.2020 17:00 - 18:00 | 0 | 0 | 0 | 0 |
| 24.05.2020 18:00 - 19:00 | 0 | 0 | 0 | 0 |
| 24.05.2020 19:00 - 20:00 | 0 | 0 | 0 | 0 |
| 24.05.2020 20:00 - 21:00 | 0 | 0 | 0 | 0 |
| 24.05.2020 21:00 - 22:00 | 0 | 0 | 0 | 0 |
| 24.05.2020 22:00 - 23:00 | 0 | 0 | 0 | 0 |
| 24.05.2020 23:00 - 24:00 | 0 | 0 | 0 | 0 |
| 25.05.2020 00:00 - 01:00 | 0 | 0 | 0 | 0 |
| 25.05.2020 01:00 - 02:00 | 0 | 0 | 0 | 0 |
| 25.05.2020 02:00 - 03:00 | 0 | 0 | 0 | 0 |
| 25.05.2020 03:00 - 04:00 | 0 | 0 | 0 | 0 |
| 25.05.2020 04:00 - 05:00 | 0 | 0 | 0 | 0 |
| 25.05.2020 05:00 - 06:00 | 0 | 0 | 0 | 0 |
| 25.05.2020 06:00 - 07:00 | 0 | 0 | 0 | 0 |
| 25.05.2020 07:00 - 08:00 | 0 | 0 | 0 | 0 |
| 25.05.2020 08:00 - 09:00 | 0 | 0 | 0 | 0 |
| 25.05.2020 09:00 - 10:00 | 0 | 0 | 0 | 0 |
| 25.05.2020 10:00 - 11:00 | 0 | 0 | 0 | 0 |
| 25.05.2020 11:00 - 12:00 | 0 | 0 | 0 | 0 |
| 25.05.2020 12:00 - 13:00 | 0 | 0 | 0 | 0 |
| 25.05.2020 13:00 - 14:00 | 0 | 0 | 0 | 0 |
| 25.05.2020 14:00 - 15:00 | 0 | 0 | 0 | 0 |
| 25.05.2020 15:00 - 16:00 | 0 | 0 | 0 | 0 |
| 25.05.2020 16:00 - 17:00 | 0 | 0 | 0 | 0 |
| 25.05.2020 17:00 - 18:00 | 0 | 0 | 0 | 0 |
| 25.05.2020 18:00 - 19:00 | 0 | 0 | 0 | 0 |
| 25.05.2020 19:00 - 20:00 | 0 | 0 | 0 | 0 |
| 25.05.2020 20:00 - 21:00 | 0 | 0 | 0 | 0 |
| 25.05.2020 21:00 - 22:00 | 0 | 0 | 0 | 0 |
| 25.05.2020 22:00 - 23:00 | 0 | 0 | 0 | 0 |
| 25.05.2020 23:00 - 24:00 | 0 | 0 | 0 | 0 |
| 26.05.2020 00:00 - 01:00 | 0 | 0 | 0 | 0 |
| 26.05.2020 01:00 - 02:00 | 0 | 0 | 0 | 0 |
| 26.05.2020 02:00 - 03:00 | 0 | 0 | 0 | 0 |
| 26.05.2020 03:00 - 04:00 | 0 | 0 | 0 | 0 |
| 26.05.2020 04:00 - 05:00 | 0 | 0 | 0 | 0 |
| 26.05.2020 05:00 - 06:00 | 0 | 0 | 0 | 0 |
| 26.05.2020 06:00 - 07:00 | 0 | 0 | 0 | 0 |
| 26.05.2020 07:00 - 08:00 | 0 | 0 | 0 | 0 |
| 26.05.2020 08:00 - 09:00 | 0 | 0 | 0 | 0 |
| 26.05.2020 09:00 - 10:00 | 0 | 0 | 0 | 0 |
| 26.05.2020 10:00 - 11:00 | 0 | 0 | 0 | 0 |
| 26.05.2020 11:00 - 12:00 | 0 | 0 | 0 | 0 |
| 26.05.2020 12:00 - 13:00 | 400 | 0 | 0 | 0 |
| 26.05.2020 13:00 - 14:00 | 400 | 0 | 0 | 0 |
| 26.05.2020 14:00 - 15:00 | 400 | 0 | 0 | 0 |
| 26.05.2020 15:00 - 16:00 | 400 | 0 | 0 | 0 |
| 26.05.2020 16:00 - 17:00 | 400 | 0 | 0 | 0 |
| 26.05.2020 17:00 - 18:00 | 400 | 0 | 0 | 0 |
| 26.05.2020 18:00 - 19:00 | 1000 | 0 | 0 | 0 |
| 26.05.2020 19:00 - 20:00 | 1000 | 0 | 0 | 0 |
| 26.05.2020 20:00 - 21:00 | 1000 | 0 | 0 | 0 |
| 26.05.2020 21:00 - 22:00 | 1300 | 0 | 0 | 0 |
| 26.05.2020 22:00 - 23:00 | 1300 | 0 | 0 | 0 |
| 26.05.2020 23:00 - 24:00 | 1800 | 0 | 0 | 0 |
| 27.05.2020 00:00 - 01:00 | 1800 | 0 | 0 | 0 |
| 27.05.2020 01:00 - 02:00 | 1800 | 0 | 0 | 0 |
| 27.05.2020 02:00 - 03:00 | 1800 | 0 | 0 | 0 |
| 27.05.2020 03:00 - 04:00 | 1800 | 0 | 0 | 0 |
| 27.05.2020 04:00 - 05:00 | 1800 | 0 | 0 | 0 |
| 27.05.2020 05:00 - 06:00 | 1800 | 0 | 0 | 0 |
| 27.05.2020 06:00 - 07:00 | 0 | 0 | 0 | 0 |
| 27.05.2020 07:00 - 08:00 | 0 | 0 | 0 | 0 |
| 27.05.2020 08:00 - 09:00 | 0 | 0 | 0 | 0 |
| 27.05.2020 09:00 - 10:00 | 0 | 0 | 0 | 0 |
| 27.05.2020 10:00 - 11:00 | 0 | 0 | 0 | 0 |
| 27.05.2020 11:00 - 12:00 | 0 | 0 | 0 | 0 |
| 27.05.2020 12:00 - 13:00 | 0 | 0 | 0 | 0 |
| 27.05.2020 13:00 - 14:00 | 0 | 0 | 0 | 0 |
| 27.05.2020 14:00 - 15:00 | 0 | 0 | 0 | 0 |
| 27.05.2020 15:00 - 16:00 | 0 | 0 | 0 | 0 |
| 27.05.2020 16:00 - 17:00 | 0 | 0 | 0 | 0 |
| 27.05.2020 17:00 - 18:00 | 0 | 0 | 0 | 0 |
| 27.05.2020 18:00 - 19:00 | 0 | 0 | 0 | 0 |
| 27.05.2020 19:00 - 20:00 | 0 | 0 | 0 | 0 |
| 27.05.2020 20:00 - 21:00 | 0 | 0 | 0 | 0 |
| 27.05.2020 21:00 - 22:00 | 0 | 0 | 0 | 0 |
| 27.05.2020 22:00 - 23:00 | 0 | 0 | 0 | 0 |
| 27.05.2020 23:00 - 24:00 | 0 | 0 | 0 | 0 |
| 28.05.2020 00:00 - 01:00 | 600 | 0 | 0 | 0 |
| 28.05.2020 01:00 - 02:00 | 600 | 0 | 0 | 0 |
| 28.05.2020 02:00 - 03:00 | 600 | 0 | 0 | 0 |
| 28.05.2020 03:00 - 04:00 | 600 | 0 | 0 | 0 |
| 28.05.2020 04:00 - 05:00 | 600 | 0 | 0 | 0 |
| 28.05.2020 05:00 - 06:00 | 600 | 0 | 0 | 0 |
| 28.05.2020 06:00 - 07:00 | 0 | 0 | 0 | 0 |
| 28.05.2020 07:00 - 08:00 | 0 | 0 | 0 | 0 |
| 28.05.2020 08:00 - 09:00 | 0 | 0 | 0 | 0 |
| 28.05.2020 09:00 - 10:00 | 0 | 0 | 0 | 0 |
| 28.05.2020 10:00 - 11:00 | 0 | 0 | 0 | 0 |
| 28.05.2020 11:00 - 12:00 | 0 | 0 | 0 | 0 |
| 28.05.2020 12:00 - 13:00 | 0 | 0 | 0 | 0 |
| 28.05.2020 13:00 - 14:00 | 0 | 0 | 0 | 0 |
| 28.05.2020 14:00 - 15:00 | 0 | 0 | 0 | 0 |
| 28.05.2020 15:00 - 16:00 | 0 | 0 | 0 | 0 |
| 28.05.2020 16:00 - 17:00 | 300 | 0 | 0 | 0 |
| 28.05.2020 17:00 - 18:00 | 300 | 0 | 0 | 0 |
| 28.05.2020 18:00 - 19:00 | 300 | 0 | 0 | 0 |
| 28.05.2020 19:00 - 20:00 | 300 | 0 | 0 | 0 |
| 28.05.2020 20:00 - 21:00 | 300 | 0 | 0 | 0 |
| 28.05.2020 21:00 - 22:00 | 300 | 0 | 0 | 0 |
| 28.05.2020 22:00 - 23:00 | 300 | 0 | 0 | 0 |
| 28.05.2020 23:00 - 24:00 | 800 | 0 | 0 | 0 |
| 29.05.2020 00:00 - 01:00 | 800 | 0 | 0 | 0 |
| 29.05.2020 01:00 - 02:00 | 800 | 0 | 0 | 0 |
| 29.05.2020 02:00 - 03:00 | 800 | 0 | 0 | 0 |
| 29.05.2020 03:00 - 04:00 | 800 | 0 | 0 | 0 |
| 29.05.2020 04:00 - 05:00 | 800 | 0 | 0 | 0 |
| 29.05.2020 05:00 - 06:00 | 800 | 0 | 0 | 0 |
| 29.05.2020 06:00 - 07:00 | 0 | 0 | 0 | 0 |
| 29.05.2020 07:00 - 08:00 | 0 | 0 | 0 | 0 |
| 29.05.2020 08:00 - 09:00 | 0 | 0 | 0 | 0 |
| 29.05.2020 09:00 - 10:00 | 0 | 0 | 0 | 0 |
| 29.05.2020 10:00 - 11:00 | 0 | 0 | 0 | 0 |
| 29.05.2020 11:00 - 12:00 | 0 | 0 | 0 | 0 |
| 29.05.2020 12:00 - 13:00 | 0 | 0 | 0 | 0 |
| 29.05.2020 13:00 - 14:00 | 0 | 0 | 0 | 0 |
| 29.05.2020 14:00 - 15:00 | 0 | 0 | 0 | 0 |
| 29.05.2020 15:00 - 16:00 | 0 | 0 | 0 | 0 |
| 29.05.2020 16:00 - 17:00 | 0 | 0 | 0 | 0 |
| 29.05.2020 17:00 - 18:00 | 0 | 0 | 0 | 0 |
| 29.05.2020 18:00 - 19:00 | 200 | 0 | 0 | 0 |
| 29.05.2020 19:00 - 20:00 | 200 | 0 | 0 | 0 |
| 29.05.2020 20:00 - 21:00 | 200 | 0 | 0 | 0 |
| 29.05.2020 21:00 - 22:00 | 200 | 0 | 0 | 0 |
| 29.05.2020 22:00 - 23:00 | 200 | 0 | 0 | 0 |
| 29.05.2020 23:00 - 24:00 | 500 | 0 | 0 | 0 |
| 30.05.2020 00:00 - 01:00 | 500 | 0 | 0 | 0 |
| 30.05.2020 01:00 - 02:00 | 500 | 0 | 0 | 0 |
| 30.05.2020 02:00 - 03:00 | 500 | 0 | 0 | 0 |
| 30.05.2020 03:00 - 04:00 | 500 | 0 | 0 | 0 |
| 30.05.2020 04:00 - 05:00 | 500 | 0 | 0 | 0 |
| 30.05.2020 05:00 - 06:00 | 500 | 0 | 0 | 0 |
| 30.05.2020 06:00 - 07:00 | 0 | 0 | 0 | 0 |
| 30.05.2020 07:00 - 08:00 | 0 | 0 | 0 | 0 |
| 30.05.2020 08:00 - 09:00 | 0 | 0 | 0 | 0 |
| 30.05.2020 09:00 - 10:00 | 0 | 0 | 0 | 0 |
| 30.05.2020 10:00 - 11:00 | 0 | 0 | 0 | 0 |
| 30.05.2020 11:00 - 12:00 | 0 | 0 | 0 | 0 |
| 30.05.2020 12:00 - 13:00 | 0 | 0 | 0 | 0 |
| 30.05.2020 13:00 - 14:00 | 0 | 0 | 0 | 0 |
| 30.05.2020 14:00 - 15:00 | 0 | 0 | 0 | 0 |
| 30.05.2020 15:00 - 16:00 | 0 | 0 | 0 | 0 |
| 30.05.2020 16:00 - 17:00 | 0 | 0 | 0 | 0 |
| 30.05.2020 17:00 - 18:00 | 0 | 0 | 0 | 0 |
| 30.05.2020 18:00 - 19:00 | 0 | 0 | 0 | 0 |
| 30.05.2020 19:00 - 20:00 | 0 | 0 | 0 | 0 |
| 30.05.2020 20:00 - 21:00 | 0 | 0 | 0 | 0 |
| 30.05.2020 21:00 - 22:00 | 0 | 0 | 0 | 0 |
| 30.05.2020 22:00 - 23:00 | 0 | 0 | 0 | 0 |
| 30.05.2020 23:00 - 24:00 | 0 | 0 | 0 | 0 |
| 31.05.2020 00:00 - 01:00 | 0 | 0 | 0 | 0 |
| 31.05.2020 01:00 - 02:00 | 0 | 0 | 0 | 0 |
| 31.05.2020 02:00 - 03:00 | 0 | 0 | 0 | 0 |
| 31.05.2020 03:00 - 04:00 | 0 | 0 | 0 | 0 |
| 31.05.2020 04:00 - 05:00 | 0 | 0 | 0 | 0 |
| 31.05.2020 05:00 - 06:00 | 0 | 0 | 0 | 0 |
| 31.05.2020 06:00 - 07:00 | 0 | 0 | 0 | 0 |
| 31.05.2020 07:00 - 08:00 | 0 | 0 | 0 | 0 |
| 31.05.2020 08:00 - 09:00 | 0 | 0 | 0 | 0 |
| 31.05.2020 09:00 - 10:00 | 0 | 0 | 0 | 0 |
| 31.05.2020 10:00 - 11:00 | 0 | 0 | 0 | 0 |
| 31.05.2020 11:00 - 12:00 | 0 | 0 | 0 | 0 |
| 31.05.2020 12:00 - 13:00 | 0 | 0 | 0 | 0 |
| 31.05.2020 13:00 - 14:00 | 0 | 0 | 0 | 0 |
| 31.05.2020 14:00 - 15:00 | 0 | 0 | 0 | 0 |
| 31.05.2020 15:00 - 16:00 | 0 | 0 | 0 | 0 |
| 31.05.2020 16:00 - 17:00 | 0 | 0 | 0 | 0 |
| 31.05.2020 17:00 - 18:00 | 0 | 0 | 0 | 0 |
| 31.05.2020 18:00 - 19:00 | 0 | 0 | 0 | 0 |
| 31.05.2020 19:00 - 20:00 | 0 | 0 | 0 | 0 |
| 31.05.2020 20:00 - 21:00 | 0 | 0 | 0 | 0 |
| 31.05.2020 21:00 - 22:00 | 0 | 0 | 0 | 0 |
| 31.05.2020 22:00 - 23:00 | 0 | 0 | 0 | 0 |
| 31.05.2020 23:00 - 24:00 | 0 | 0 | 0 | 0 |
| 01.06.2020 00:00 - 01:00 | 0 | 0 | 0 | 0 |
| 01.06.2020 01:00 - 02:00 | 0 | 0 | 0 | 0 |
| 01.06.2020 02:00 - 03:00 | 0 | 0 | 0 | 0 |
| 01.06.2020 03:00 - 04:00 | 0 | 0 | 0 | 0 |
| 01.06.2020 04:00 - 05:00 | 0 | 0 | 0 | 0 |
| 01.06.2020 05:00 - 06:00 | 0 | 0 | 0 | 0 |